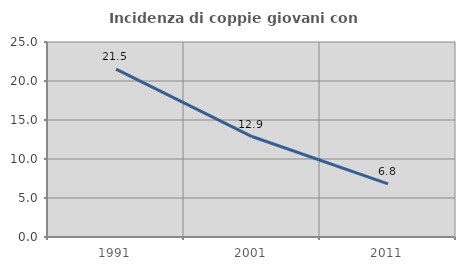
| Category | Incidenza di coppie giovani con figli |
|---|---|
| 1991.0 | 21.515 |
| 2001.0 | 12.88 |
| 2011.0 | 6.801 |